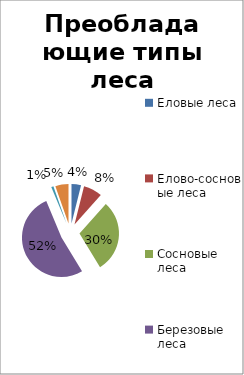
| Category | Series 0 |
|---|---|
| Еловые леса | 3.9 |
| Елово-сосновые леса | 7.7 |
| Сосновые леса | 29.7 |
| Березовые леса | 52.4 |
| Черемуховые, мелколиственные смешанные леса | 0.9 |
| Черноольховые леса | 5.4 |